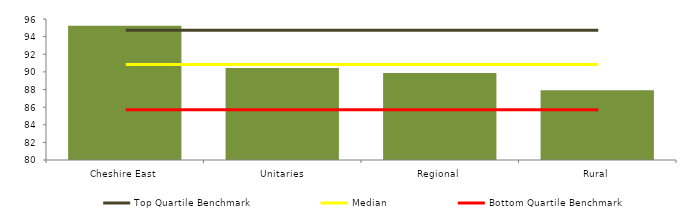
| Category | Block Data |
|---|---|
| Cheshire East | 95.238 |
| Unitaries | 90.445 |
| Regional | 89.874 |
|  Rural  | 87.926 |